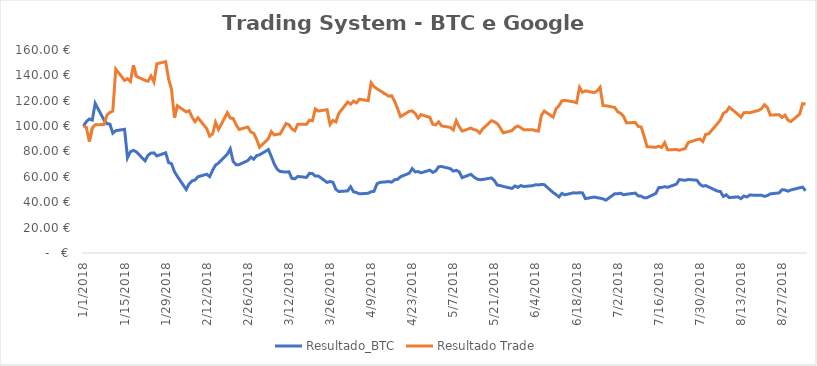
| Category | Resultado_BTC | Resultado Trade |
|---|---|---|
| 1/1/18 | 100 | 100 |
| 1/2/18 | 103.595 | 98.985 |
| 1/3/18 | 105.619 | 87.72 |
| 1/4/18 | 104.758 | 98.578 |
| 1/5/18 | 117.945 | 101.119 |
| 1/8/18 | 104.768 | 101.24 |
| 1/9/18 | 101.937 | 108.74 |
| 1/10/18 | 101.611 | 110.787 |
| 1/11/18 | 94.428 | 111.824 |
| 1/12/18 | 96.394 | 144.956 |
| 1/15/18 | 97.49 | 135.984 |
| 1/16/18 | 75.091 | 137.383 |
| 1/17/18 | 79.876 | 135.164 |
| 1/18/18 | 80.857 | 147.986 |
| 1/19/18 | 79.713 | 139.241 |
| 1/22/18 | 72.673 | 136.07 |
| 1/23/18 | 77.074 | 135.378 |
| 1/24/18 | 78.709 | 139.476 |
| 1/25/18 | 78.953 | 134.776 |
| 1/26/18 | 76.484 | 149.104 |
| 1/29/18 | 78.988 | 150.826 |
| 1/30/18 | 71.269 | 137.214 |
| 1/31/18 | 70.316 | 128.844 |
| 2/1/18 | 64.111 | 106.678 |
| 2/2/18 | 60.328 | 116.063 |
| 2/5/18 | 50.07 | 111.17 |
| 2/6/18 | 54.575 | 112.196 |
| 2/7/18 | 56.858 | 107.072 |
| 2/8/18 | 57.496 | 103.501 |
| 2/9/18 | 60.122 | 106.588 |
| 2/12/18 | 62.068 | 98.012 |
| 2/13/18 | 60.153 | 92.089 |
| 2/14/18 | 65.275 | 93.905 |
| 2/15/18 | 69.326 | 102.97 |
| 2/16/18 | 70.832 | 97.312 |
| 2/19/18 | 77.811 | 110.587 |
| 2/20/18 | 82.161 | 106.367 |
| 2/21/18 | 72.172 | 106.01 |
| 2/22/18 | 69.562 | 101.114 |
| 2/23/18 | 69.656 | 97.354 |
| 2/26/18 | 72.876 | 99.276 |
| 2/27/18 | 75.534 | 95.408 |
| 2/28/18 | 73.927 | 94.419 |
| 3/1/18 | 76.764 | 89.481 |
| 3/2/18 | 77.412 | 83.343 |
| 3/5/18 | 81.512 | 90.218 |
| 3/6/18 | 76.083 | 95.729 |
| 3/7/18 | 70.156 | 93.036 |
| 3/8/18 | 65.993 | 93.583 |
| 3/9/18 | 64.268 | 93.811 |
| 3/11/18 | 63.766 | 101.998 |
| 3/12/18 | 64.049 | 101.155 |
| 3/13/18 | 58.8 | 97.767 |
| 3/14/18 | 58.432 | 96.377 |
| 3/15/18 | 60.332 | 101.371 |
| 3/18/18 | 59.595 | 101.462 |
| 3/19/18 | 62.803 | 104.676 |
| 3/20/18 | 62.621 | 104.212 |
| 3/21/18 | 60.581 | 113.537 |
| 3/22/18 | 60.729 | 111.89 |
| 3/25/18 | 55.639 | 112.932 |
| 3/26/18 | 56.344 | 101.341 |
| 3/27/18 | 55.714 | 104.549 |
| 3/28/18 | 50.107 | 103.363 |
| 3/29/18 | 48.476 | 110.09 |
| 4/1/18 | 48.932 | 118.963 |
| 4/2/18 | 52.215 | 117.339 |
| 4/3/18 | 48.231 | 119.714 |
| 4/4/18 | 47.669 | 118.369 |
| 4/5/18 | 46.633 | 121.21 |
| 4/8/18 | 47.067 | 120.023 |
| 4/9/18 | 48.291 | 134.192 |
| 4/10/18 | 48.67 | 131.174 |
| 4/11/18 | 54.513 | 129.398 |
| 4/12/18 | 55.653 | 128.026 |
| 4/15/18 | 56.303 | 123.557 |
| 4/16/18 | 55.819 | 123.971 |
| 4/17/18 | 57.719 | 119.546 |
| 4/18/18 | 58.027 | 113.882 |
| 4/19/18 | 60.051 | 107.452 |
| 4/22/18 | 62.905 | 111.671 |
| 4/23/18 | 66.529 | 112 |
| 4/24/18 | 63.892 | 110.031 |
| 4/25/18 | 64.208 | 106.293 |
| 4/26/18 | 63.207 | 109.052 |
| 4/29/18 | 65.295 | 106.917 |
| 4/30/18 | 63.519 | 101.442 |
| 5/1/18 | 64.655 | 100.981 |
| 5/2/18 | 68.002 | 103.394 |
| 5/3/18 | 68.175 | 100.178 |
| 5/6/18 | 66.455 | 98.979 |
| 5/7/18 | 64.521 | 96.976 |
| 5/8/18 | 65.17 | 104.266 |
| 5/9/18 | 63.982 | 99.614 |
| 5/10/18 | 59.398 | 96.08 |
| 5/13/18 | 62.042 | 98.488 |
| 5/14/18 | 59.965 | 97.251 |
| 5/15/18 | 58.385 | 96.797 |
| 5/16/18 | 57.769 | 94.544 |
| 5/17/18 | 57.923 | 97.804 |
| 5/20/18 | 59.183 | 104.258 |
| 5/21/18 | 57.1 | 103.392 |
| 5/22/18 | 53.465 | 101.901 |
| 5/23/18 | 53.127 | 98.574 |
| 5/24/18 | 52.468 | 94.688 |
| 5/27/18 | 50.859 | 96.51 |
| 5/28/18 | 52.837 | 98.933 |
| 5/29/18 | 51.738 | 100.098 |
| 5/30/18 | 53.14 | 98.727 |
| 5/31/18 | 52.417 | 97.194 |
| 6/3/18 | 53.038 | 97.179 |
| 6/4/18 | 53.765 | 96.424 |
| 6/5/18 | 53.666 | 96.042 |
| 6/6/18 | 53.977 | 108.381 |
| 6/7/18 | 53.871 | 111.889 |
| 6/10/18 | 47.653 | 107.089 |
| 6/11/18 | 46.07 | 113.612 |
| 6/12/18 | 44.186 | 116.151 |
| 6/13/18 | 46.966 | 119.986 |
| 6/14/18 | 45.849 | 120.295 |
| 6/17/18 | 47.455 | 119.143 |
| 6/18/18 | 47.239 | 118.357 |
| 6/19/18 | 47.599 | 130.546 |
| 6/20/18 | 47.381 | 126.726 |
| 6/21/18 | 42.879 | 127.808 |
| 6/24/18 | 44.081 | 126.359 |
| 6/25/18 | 43.621 | 127.774 |
| 6/26/18 | 43.214 | 130.57 |
| 6/27/18 | 42.651 | 116.209 |
| 6/28/18 | 41.656 | 116.097 |
| 7/1/18 | 46.699 | 114.669 |
| 7/2/18 | 46.651 | 111.348 |
| 7/3/18 | 47.136 | 110.044 |
| 7/4/18 | 45.865 | 107.717 |
| 7/5/18 | 46.315 | 102.551 |
| 7/8/18 | 47.219 | 102.894 |
| 7/9/18 | 45.049 | 99.756 |
| 7/10/18 | 44.81 | 99.339 |
| 7/11/18 | 43.533 | 92.114 |
| 7/12/18 | 43.628 | 83.759 |
| 7/15/18 | 46.948 | 83.334 |
| 7/16/18 | 51.518 | 84.1 |
| 7/17/18 | 51.677 | 83.188 |
| 7/18/18 | 52.256 | 86.966 |
| 7/19/18 | 51.794 | 81.32 |
| 7/22/18 | 54.25 | 81.592 |
| 7/23/18 | 57.893 | 81.012 |
| 7/24/18 | 57.585 | 81.72 |
| 7/25/18 | 57.291 | 82.293 |
| 7/26/18 | 57.907 | 87.029 |
| 7/29/18 | 57.39 | 89.306 |
| 7/30/18 | 54.164 | 89.904 |
| 7/31/18 | 52.68 | 87.854 |
| 8/1/18 | 53.138 | 93.542 |
| 8/2/18 | 52.032 | 93.947 |
| 8/5/18 | 48.777 | 102.037 |
| 8/6/18 | 48.47 | 104.905 |
| 8/7/18 | 44.545 | 110.065 |
| 8/8/18 | 45.886 | 111.372 |
| 8/9/18 | 43.652 | 114.844 |
| 8/12/18 | 44.258 | 109.256 |
| 8/13/18 | 42.837 | 107.06 |
| 8/14/18 | 44.933 | 110.574 |
| 8/15/18 | 44.12 | 110.697 |
| 8/16/18 | 45.657 | 110.569 |
| 8/19/18 | 45.515 | 112.395 |
| 8/20/18 | 45.476 | 113.725 |
| 8/21/18 | 44.65 | 116.858 |
| 8/22/18 | 45.267 | 114.683 |
| 8/23/18 | 46.605 | 108.682 |
| 8/26/18 | 47.393 | 109.05 |
| 8/27/18 | 49.904 | 106.831 |
| 8/28/18 | 49.637 | 108.662 |
| 8/29/18 | 48.726 | 104.701 |
| 8/30/18 | 49.658 | 103.571 |
| 9/2/18 | 51.43 | 109.469 |
| 9/3/18 | 51.886 | 117.712 |
| 9/4/18 | 48.998 | 117.388 |